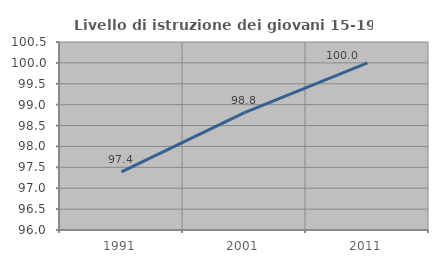
| Category | Livello di istruzione dei giovani 15-19 anni |
|---|---|
| 1991.0 | 97.391 |
| 2001.0 | 98.81 |
| 2011.0 | 100 |